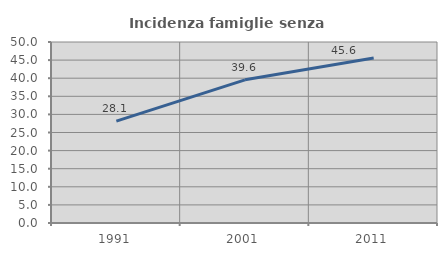
| Category | Incidenza famiglie senza nuclei |
|---|---|
| 1991.0 | 28.125 |
| 2001.0 | 39.55 |
| 2011.0 | 45.585 |